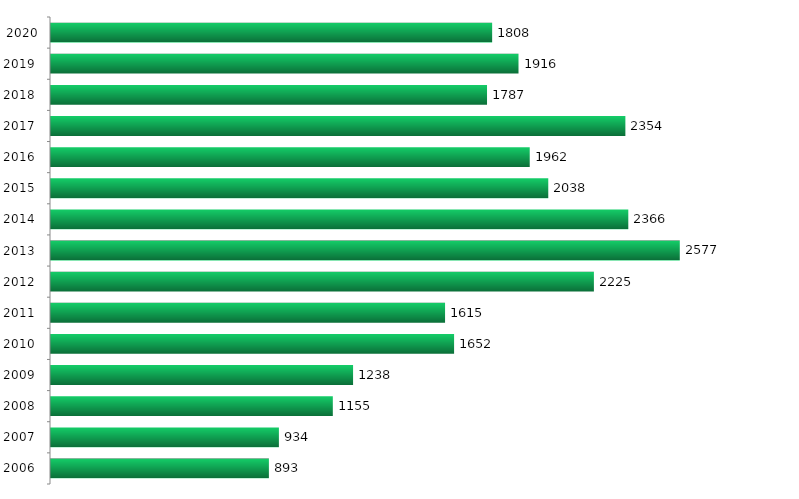
| Category | Ingressantes |
|---|---|
| 2006.0 | 893 |
| 2007.0 | 934 |
| 2008.0 | 1155 |
| 2009.0 | 1238 |
| 2010.0 | 1652 |
| 2011.0 | 1615 |
| 2012.0 | 2225 |
| 2013.0 | 2577 |
| 2014.0 | 2366 |
| 2015.0 | 2038 |
| 2016.0 | 1962 |
| 2017.0 | 2354 |
| 2018.0 | 1787 |
| 2019.0 | 1916 |
| 2020.0 | 1808 |